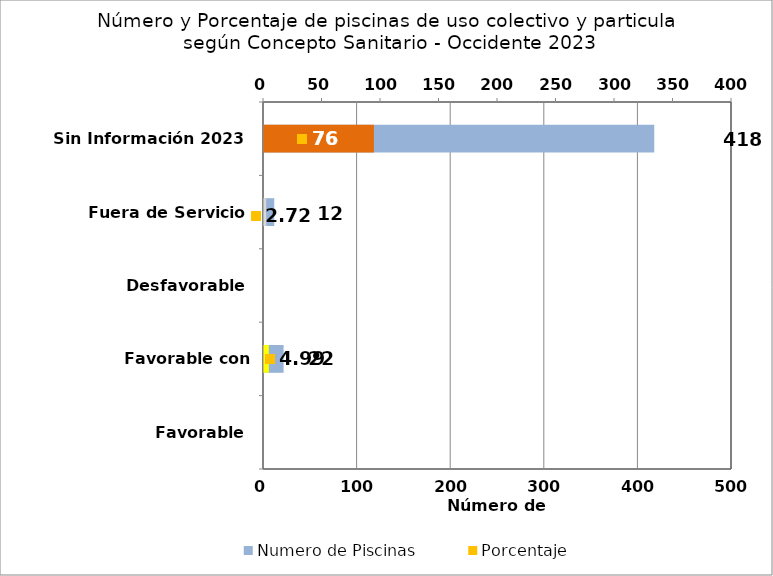
| Category | Numero de Piscinas |
|---|---|
| Favorable | 0 |
| Favorable con Requerimientos | 22 |
| Desfavorable | 0 |
| Fuera de Servicio | 12 |
| Sin Información 2023 | 418 |